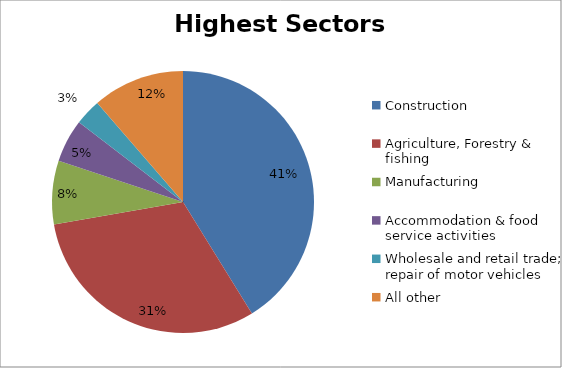
| Category | Sectors with highest totals | Percentage |
|---|---|---|
| Construction | 6315 | 0.412 |
| Agriculture, Forestry & fishing | 4763 | 0.311 |
| Manufacturing | 1203 | 0.078 |
| Accommodation & food service activities | 814 | 0.053 |
| Wholesale and retail trade; repair of motor vehicles  | 498 | 0.032 |
| All other | 1741 | 0.114 |